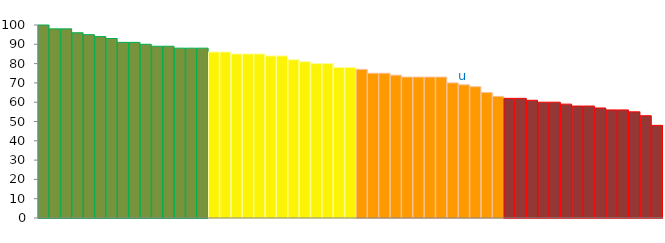
| Category | Top Quartile | 2nd Quartile | 3rd Quartile | Bottom Quartile | Series 4 |
|---|---|---|---|---|---|
|  | 100 | 0 | 0 | 0 | 100 |
|  | 98 | 0 | 0 | 0 | 98 |
|  | 98 | 0 | 0 | 0 | 98 |
|  | 96 | 0 | 0 | 0 | 96 |
|  | 95 | 0 | 0 | 0 | 95 |
|  | 94 | 0 | 0 | 0 | 94 |
|  | 93 | 0 | 0 | 0 | 93 |
|  | 91 | 0 | 0 | 0 | 91 |
|  | 91 | 0 | 0 | 0 | 91 |
|  | 90 | 0 | 0 | 0 | 90 |
|  | 89 | 0 | 0 | 0 | 89 |
|  | 89 | 0 | 0 | 0 | 89 |
|  | 88 | 0 | 0 | 0 | 88 |
|  | 88 | 0 | 0 | 0 | 88 |
|  | 88 | 0 | 0 | 0 | 88 |
|  | 0 | 86 | 0 | 0 | 86 |
|  | 0 | 86 | 0 | 0 | 86 |
|  | 0 | 85 | 0 | 0 | 85 |
|  | 0 | 85 | 0 | 0 | 85 |
|  | 0 | 85 | 0 | 0 | 85 |
|  | 0 | 84 | 0 | 0 | 84 |
|  | 0 | 84 | 0 | 0 | 84 |
|  | 0 | 82 | 0 | 0 | 82 |
|  | 0 | 81 | 0 | 0 | 81 |
|  | 0 | 80 | 0 | 0 | 80 |
|  | 0 | 80 | 0 | 0 | 80 |
|  | 0 | 78 | 0 | 0 | 78 |
|  | 0 | 78 | 0 | 0 | 78 |
|  | 0 | 0 | 77 | 0 | 77 |
|  | 0 | 0 | 75 | 0 | 75 |
|  | 0 | 0 | 75 | 0 | 75 |
|  | 0 | 0 | 74 | 0 | 74 |
|  | 0 | 0 | 73 | 0 | 73 |
|  | 0 | 0 | 73 | 0 | 73 |
|  | 0 | 0 | 73 | 0 | 73 |
|  | 0 | 0 | 73 | 0 | 73 |
|  | 0 | 0 | 70 | 0 | 70 |
| u | 0 | 0 | 69 | 0 | 69 |